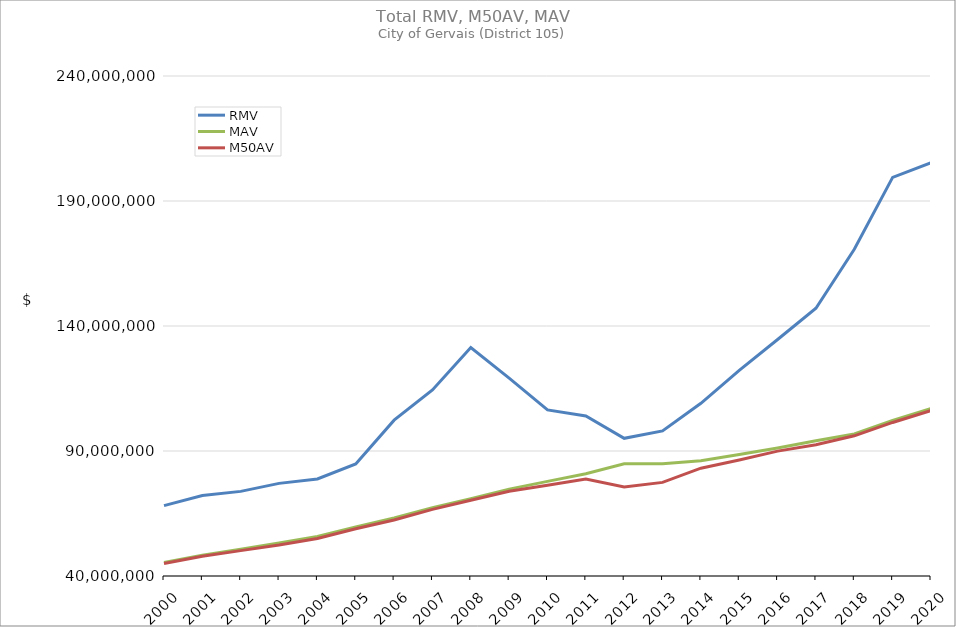
| Category | RMV | MAV | M50AV |
|---|---|---|---|
| 2000.0 | 68155863 | 45420672 | 45006826 |
| 2001.0 | 72210349 | 48319490 | 47887536 |
| 2002.0 | 73844843 | 50696784 | 50145439 |
| 2003.0 | 77048926 | 53173270 | 52384461 |
| 2004.0 | 78824157 | 55772486 | 54984773 |
| 2005.0 | 84852809 | 59661810 | 58879509 |
| 2006.0 | 102321898 | 63200047 | 62417330 |
| 2007.0 | 114428780 | 67324032 | 66651889 |
| 2008.0 | 131375325 | 70938029 | 70270381 |
| 2009.0 | 119153820 | 74746796 | 73921836 |
| 2010.0 | 106439867 | 77859117 | 76276739 |
| 2011.0 | 104033807 | 80926670 | 78816503 |
| 2012.0 | 95071246 | 84864686 | 75592276 |
| 2013.0 | 98025282 | 84942104 | 77454356 |
| 2014.0 | 109073551 | 86072780 | 83113554 |
| 2015.0 | 122271603 | 88581754 | 86409376 |
| 2016.0 | 134608836 | 91177678 | 89954768 |
| 2017.0 | 147085803 | 94108746 | 92487386 |
| 2018.0 | 170678751 | 96800455 | 96081842 |
| 2019.0 | 199460752 | 102250838 | 101418318 |
| 2020.0 | 205270613 | 107008734 | 106166883 |